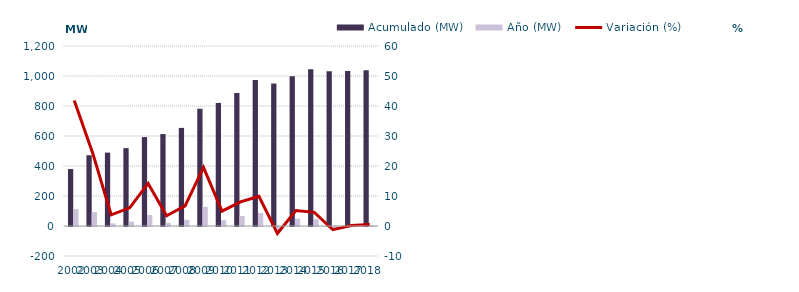
| Category | Acumulado (MW) | Año (MW) |
|---|---|---|
| 2002.0 | 379.492 | 111.954 |
| 2003.0 | 471.643 | 92.151 |
| 2004.0 | 489.279 | 17.635 |
| 2005.0 | 518.97 | 29.692 |
| 2006.0 | 592.628 | 73.658 |
| 2007.0 | 612.965 | 20.336 |
| 2008.0 | 654.063 | 41.098 |
| 2009.0 | 781.673 | 127.61 |
| 2010.0 | 820.352 | 38.679 |
| 2011.0 | 886.288 | 65.936 |
| 2012.0 | 973.93 | 87.643 |
| 2013.0 | 949.94 | -23.99 |
| 2014.0 | 998.853 | 48.913 |
| 2015.0 | 1044.348 | 45.495 |
| 2016.0 | 1031.405 | -12.943 |
| 2017.0 | 1033.132 | 1.726 |
| 2018.0 | 1038.231 | 5.1 |